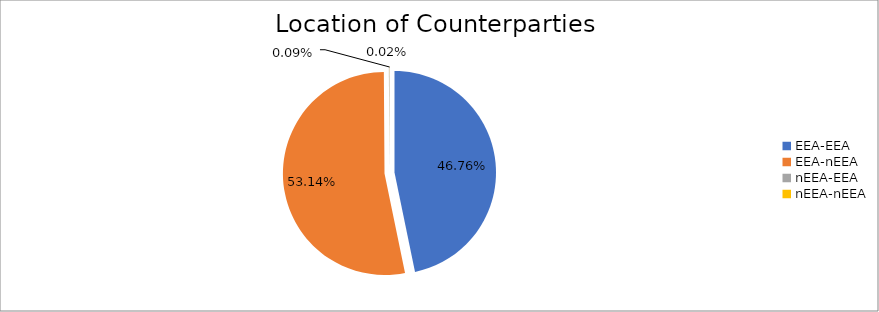
| Category | Series 0 |
|---|---|
| EEA-EEA | 5295924.181 |
| EEA-nEEA | 6019016.745 |
| nEEA-EEA | 9945.577 |
| nEEA-nEEA | 1738.58 |